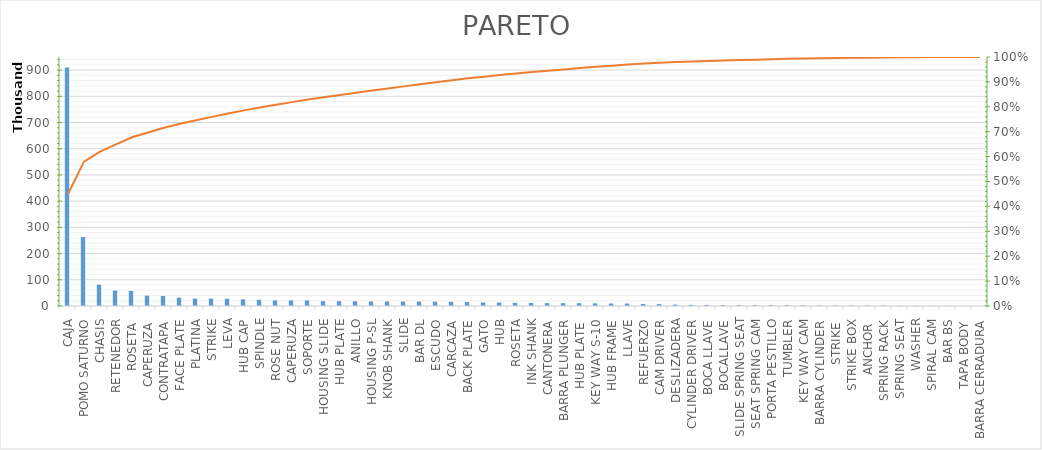
| Category | Desperdicio Unidades |
|---|---|
| CAJA | 910172.76 |
| POMO SATURNO | 262959.279 |
| CHASIS | 81341.309 |
| RETENEDOR | 59021.665 |
| ROSETA  | 57704.819 |
| CAPERUZA  | 39554.292 |
| CONTRATAPA | 38167.665 |
| FACE PLATE | 31889.564 |
| PLATINA | 28186.143 |
| STRIKE | 28143.48 |
| LEVA | 27642.264 |
| HUB CAP | 25290.152 |
| SPINDLE | 23715.511 |
| ROSE NUT | 21622.182 |
| CAPERUZA | 21591.987 |
| SOPORTE | 21211.12 |
| HOUSING SLIDE | 18553.182 |
| HUB PLATE | 18503.719 |
| ANILLO | 18103.747 |
| HOUSING P-SL | 17362.344 |
| KNOB SHANK | 17217.29 |
| SLIDE | 17135.033 |
| BAR DL | 16967.558 |
| ESCUDO | 16461.54 |
| CARCAZA | 16220.909 |
| BACK PLATE | 15578.266 |
| GATO | 13624.696 |
| HUB | 13320.29 |
| ROSETA | 12104.73 |
| INK SHANK | 11874.945 |
| CANTONERA | 10907.806 |
| BARRA PLUNGER | 10783.422 |
| HUB PLATE  | 10745.928 |
| KEY WAY S-10 | 10176.126 |
| HUB FRAME | 9582.632 |
| LLAVE | 9340.956 |
| REFUERZO | 7944.422 |
| CAM DRIVER | 7338.578 |
| DESLIZADERA | 5359.947 |
| CYLINDER DRIVER | 4413.401 |
| BOCA LLAVE | 3993.212 |
| BOCALLAVE | 3739.696 |
| SLIDE SPRING SEAT | 3470.227 |
| SEAT SPRING CAM | 3464.076 |
| PORTA PESTILLO | 3201.059 |
| TUMBLER | 3185.39 |
| KEY WAY CAM | 2698.634 |
| BARRA CYLINDER | 1971.578 |
| STRIKE  | 1734.865 |
| STRIKE BOX | 1711.054 |
| ANCHOR  | 1547.927 |
| SPRING RACK | 1468.022 |
| SPRING SEAT | 1045.673 |
| WASHER | 1028.446 |
| SPIRAL CAM | 760.21 |
| BAR BS | 662.38 |
| TAPA BODY | 317.445 |
| BARRA CERRADURA | 33.743 |